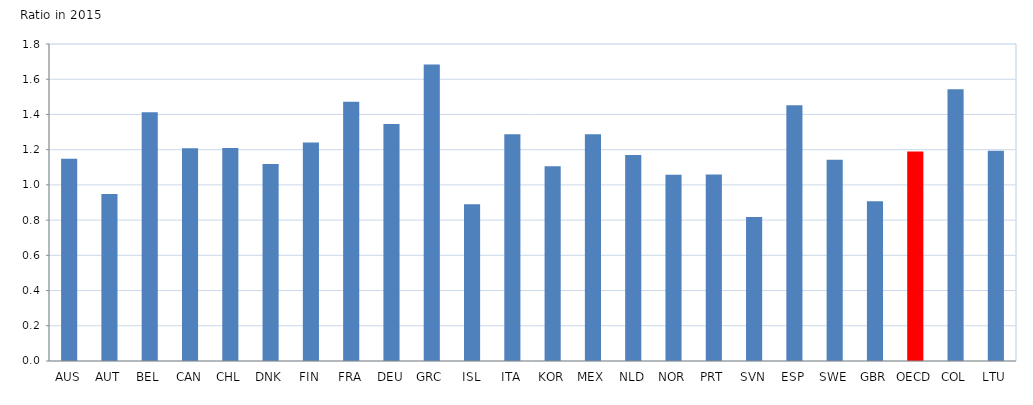
| Category | Secretarial position |
|---|---|
| AUS | 1.149 |
| AUT | 0.949 |
| BEL | 1.413 |
| CAN | 1.208 |
| CHL | 1.209 |
| DNK | 1.119 |
| FIN | 1.241 |
| FRA | 1.473 |
| DEU | 1.346 |
| GRC | 1.684 |
| ISL | 0.89 |
| ITA | 1.288 |
| KOR | 1.106 |
| MEX | 1.288 |
| NLD | 1.17 |
| NOR | 1.058 |
| PRT | 1.059 |
| SVN | 0.818 |
| ESP | 1.452 |
| SWE | 1.143 |
| GBR | 0.908 |
| OECD | 1.189 |
| COL | 1.543 |
| LTU | 1.194 |